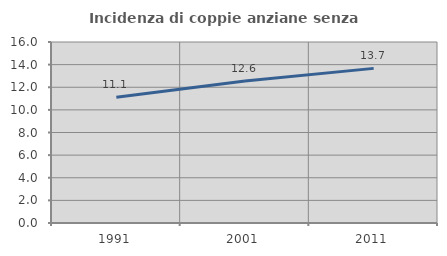
| Category | Incidenza di coppie anziane senza figli  |
|---|---|
| 1991.0 | 11.111 |
| 2001.0 | 12.559 |
| 2011.0 | 13.669 |